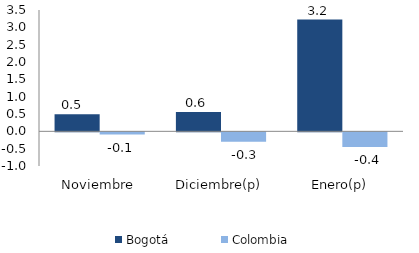
| Category | Bogotá | Colombia |
|---|---|---|
| Noviembre | 0.49 | -0.065 |
| Diciembre(p) | 0.555 | -0.272 |
| Enero(p) | 3.223 | -0.423 |